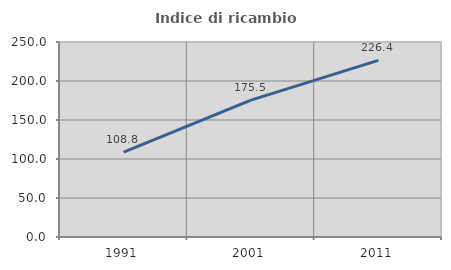
| Category | Indice di ricambio occupazionale  |
|---|---|
| 1991.0 | 108.82 |
| 2001.0 | 175.539 |
| 2011.0 | 226.357 |